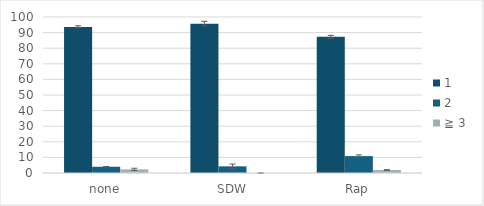
| Category | 1 | 2 | ≧ 3 |
|---|---|---|---|
| none | 93.667 | 4 | 2.333 |
| SDW | 95.74 | 4.26 | 0 |
| Rap | 87.278 | 10.827 | 1.894 |